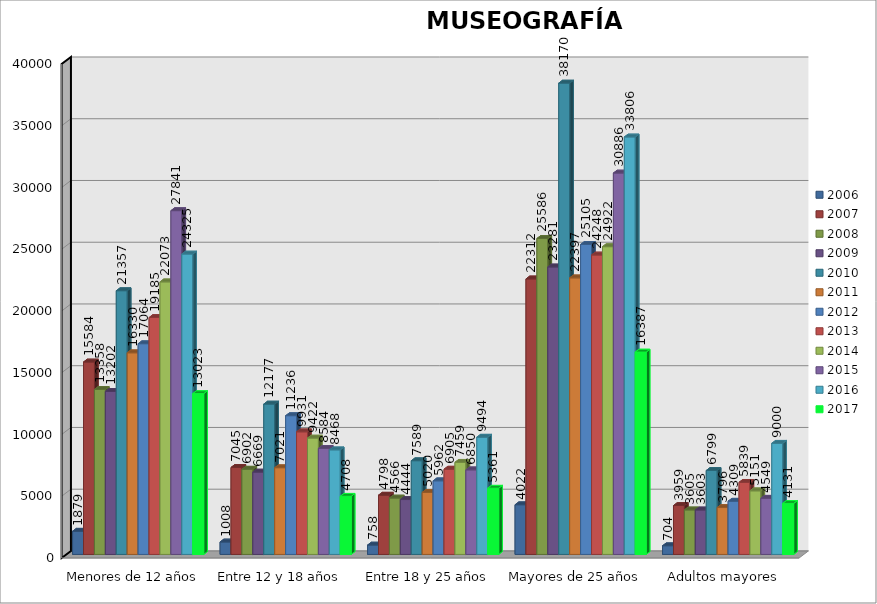
| Category | 2006 | 2007 | 2008 | 2009 | 2010 | 2011 | 2012 | 2013 | 2014 | 2015 | 2016 | 2017 |
|---|---|---|---|---|---|---|---|---|---|---|---|---|
| Menores de 12 años | 1879 | 15584 | 13358 | 13202 | 21357 | 16330 | 17064 | 19185 | 22073 | 27841 | 24325 | 13023 |
| Entre 12 y 18 años | 1008 | 7045 | 6902 | 6669 | 12177 | 7021 | 11236 | 9931 | 9422 | 8584 | 8468 | 4708 |
| Entre 18 y 25 años | 758 | 4798 | 4566 | 4444 | 7589 | 5020 | 5962 | 6905 | 7459 | 6850 | 9494 | 5361 |
| Mayores de 25 años | 4022 | 22312 | 25586 | 23281 | 38170 | 22397 | 25105 | 24248 | 24922 | 30886 | 33806 | 16387 |
| Adultos mayores | 704 | 3959 | 3605 | 3603 | 6799 | 3796 | 4309 | 5839 | 5151 | 4549 | 9000 | 4131 |